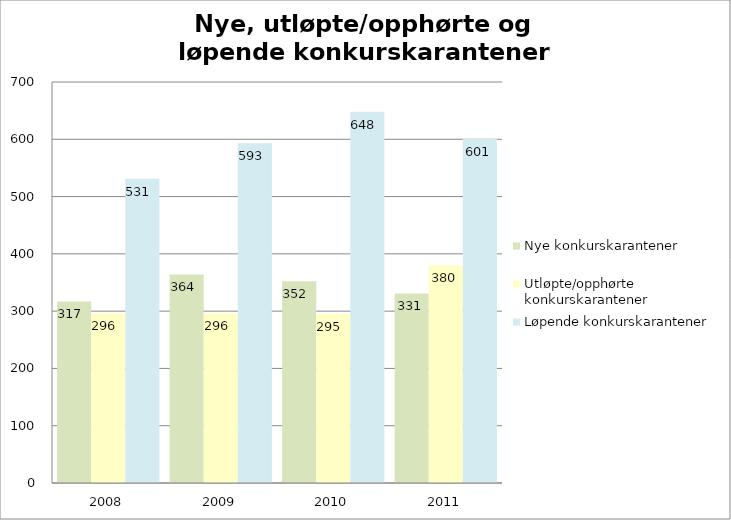
| Category | Nye konkurskarantener | Utløpte/opphørte konkurskarantener | Løpende konkurskarantener |
|---|---|---|---|
| 2008.0 | 317 | 296 | 531 |
| 2009.0 | 364 | 296 | 593 |
| 2010.0 | 352 | 295 | 648 |
| 2011.0 | 331 | 380 | 601 |